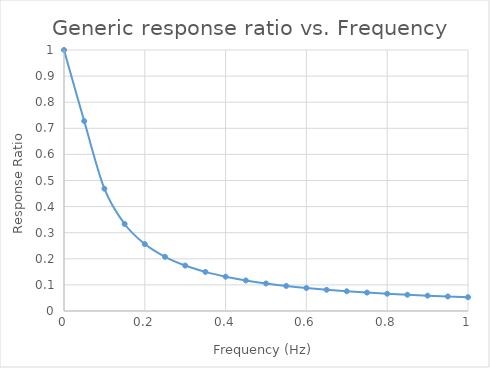
| Category | Series 0 |
|---|---|
| 0.0 | 1 |
| 0.05 | 0.728 |
| 0.1 | 0.469 |
| 0.15 | 0.333 |
| 0.2 | 0.256 |
| 0.25 | 0.208 |
| 0.3 | 0.174 |
| 0.35 | 0.15 |
| 0.4 | 0.131 |
| 0.45 | 0.117 |
| 0.5 | 0.106 |
| 0.55 | 0.096 |
| 0.6 | 0.088 |
| 0.65 | 0.081 |
| 0.7 | 0.076 |
| 0.75 | 0.071 |
| 0.8 | 0.066 |
| 0.85 | 0.062 |
| 0.9 | 0.059 |
| 0.95 | 0.056 |
| 1.0 | 0.053 |